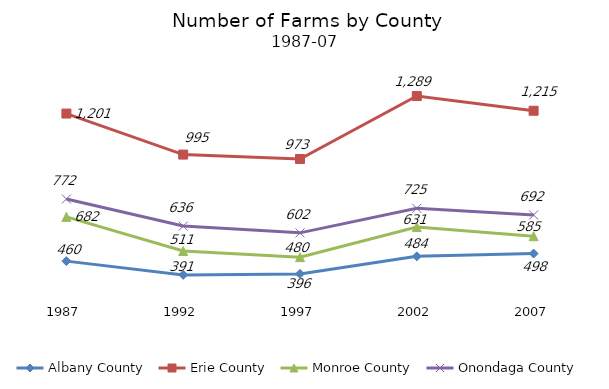
| Category | Albany County | Erie County | Monroe County | Onondaga County  |
|---|---|---|---|---|
| 1987.0 | 460 | 1201 | 682 | 772 |
| 1992.0 | 391 | 995 | 511 | 636 |
| 1997.0 | 396 | 973 | 480 | 602 |
| 2002.0 | 484 | 1289 | 631 | 725 |
| 2007.0 | 498 | 1215 | 585 | 692 |